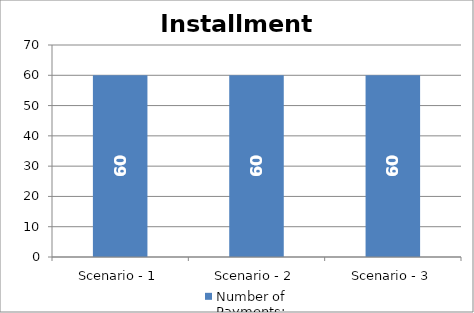
| Category | Number of Payments: |
|---|---|
| Scenario - 1 | 60 |
| Scenario - 2 | 60 |
| Scenario - 3 | 60 |